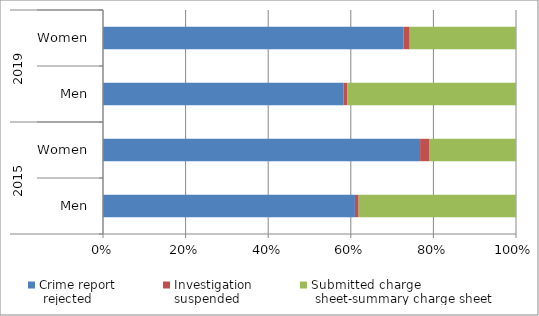
| Category | Crime report
 rejected | Investigation
suspended | Submitted charge
 sheet-summary charge sheet  |
|---|---|---|---|
| 0 | 60.96 | 0.899 | 38.075 |
| 1 | 76.778 | 2.301 | 20.921 |
| 2 | 58.269 | 0.917 | 40.814 |
| 3 | 72.769 | 1.487 | 25.744 |